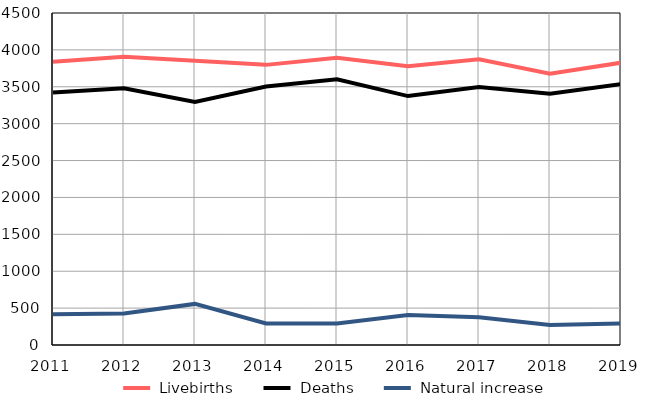
| Category |  Livebirths |  Deaths |  Natural increase |
|---|---|---|---|
| 2011.0 | 3838 | 3422 | 416 |
| 2012.0 | 3907 | 3480 | 427 |
| 2013.0 | 3852 | 3295 | 557 |
| 2014.0 | 3797 | 3504 | 293 |
| 2015.0 | 3892 | 3601 | 291 |
| 2016.0 | 3779 | 3374 | 405 |
| 2017.0 | 3872 | 3497 | 375 |
| 2018.0 | 3676 | 3405 | 271 |
| 2019.0 | 3826 | 3535 | 291 |